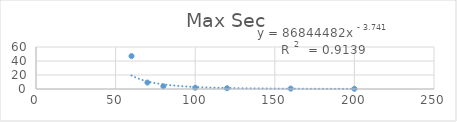
| Category | Max Sec |
|---|---|
| 60.0 | 47 |
| 70.0 | 9.2 |
| 80.0 | 3.9 |
| 100.0 | 1.8 |
| 120.0 | 1.1 |
| 160.0 | 0.6 |
| 200.0 | 0.3 |